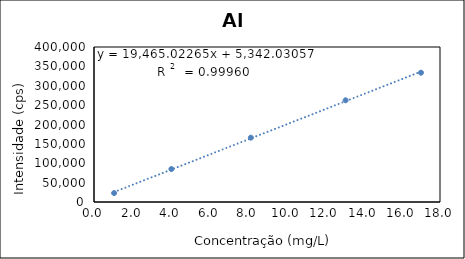
| Category | Series 0 |
|---|---|
| 1.0465336180616678 | 23071.439 |
| 4.026115557179576 | 85011.639 |
| 8.158846288557237 | 165974.839 |
| 13.089531820162671 | 262464.839 |
| 17.011028244534515 | 333646.839 |